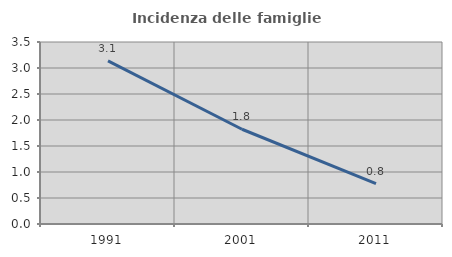
| Category | Incidenza delle famiglie numerose |
|---|---|
| 1991.0 | 3.138 |
| 2001.0 | 1.822 |
| 2011.0 | 0.775 |